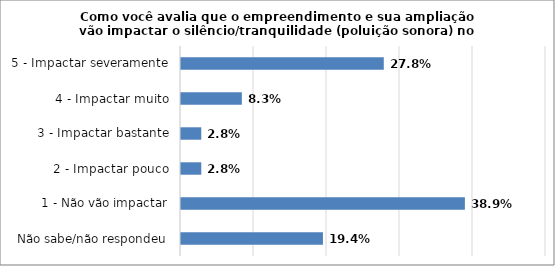
| Category | Series 0 |
|---|---|
| Não sabe/não respondeu | 0.194 |
| 1 - Não vão impactar | 0.389 |
| 2 - Impactar pouco | 0.028 |
| 3 - Impactar bastante | 0.028 |
| 4 - Impactar muito | 0.083 |
| 5 - Impactar severamente | 0.278 |